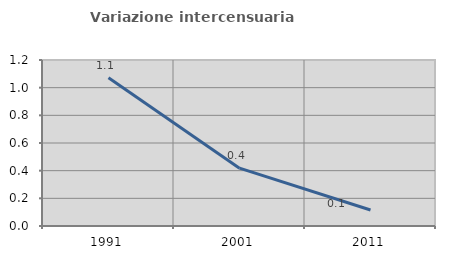
| Category | Variazione intercensuaria annua |
|---|---|
| 1991.0 | 1.071 |
| 2001.0 | 0.418 |
| 2011.0 | 0.116 |